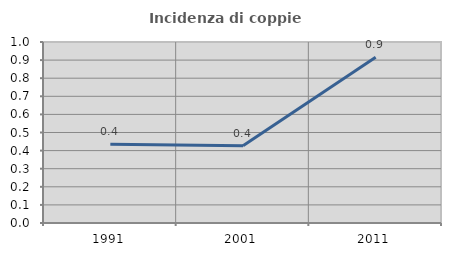
| Category | Incidenza di coppie miste |
|---|---|
| 1991.0 | 0.435 |
| 2001.0 | 0.426 |
| 2011.0 | 0.916 |